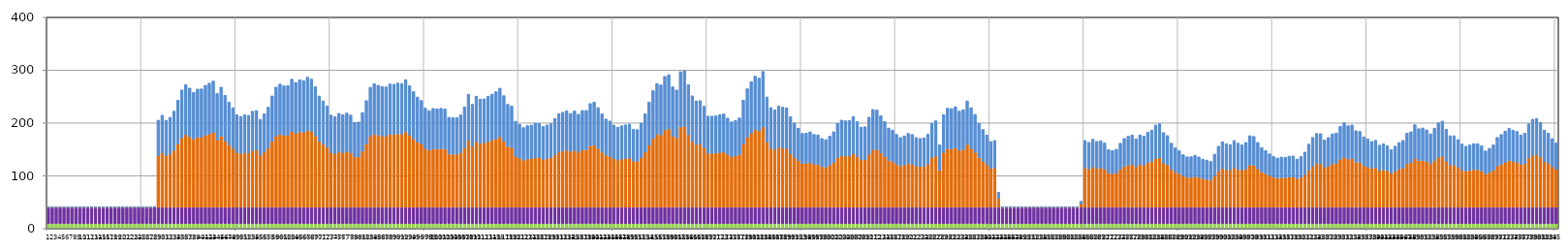
| Category | ВЛ_Корона | Т_ХХ | ВЛ_Нагр | Т_Нагр |
|---|---|---|---|---|
| 0 | 9.177 | 31 | 0 | 0 |
| 1 | 9.177 | 31 | 0 | 0 |
| 2 | 9.177 | 31 | 0 | 0 |
| 3 | 9.177 | 31 | 0 | 0 |
| 4 | 9.177 | 31 | 0 | 0 |
| 5 | 9.177 | 31 | 0 | 0 |
| 6 | 9.177 | 31 | 0 | 0 |
| 7 | 9.177 | 31 | 0 | 0 |
| 8 | 9.177 | 31 | 0 | 0 |
| 9 | 9.177 | 31 | 0 | 0 |
| 10 | 9.177 | 31 | 0 | 0 |
| 11 | 9.177 | 31 | 0 | 0 |
| 12 | 9.177 | 31 | 0 | 0 |
| 13 | 9.177 | 31 | 0 | 0 |
| 14 | 9.177 | 31 | 0 | 0 |
| 15 | 9.177 | 31 | 0 | 0 |
| 16 | 9.177 | 31 | 0 | 0 |
| 17 | 9.177 | 31 | 0 | 0 |
| 18 | 9.177 | 31 | 0 | 0 |
| 19 | 9.177 | 31 | 0 | 0 |
| 20 | 9.177 | 31 | 0 | 0 |
| 21 | 9.177 | 31 | 0 | 0 |
| 22 | 9.177 | 31 | 0 | 0 |
| 23 | 9.177 | 31 | 0 | 0 |
| 24 | 9.177 | 31 | 0 | 0 |
| 25 | 9.177 | 31 | 0 | 0 |
| 26 | 9.177 | 31 | 0 | 0 |
| 27 | 9.177 | 31 | 0.81 | 0.565 |
| 28 | 9.177 | 31 | 97.529 | 67.565 |
| 29 | 9.177 | 31 | 103.119 | 71.423 |
| 30 | 9.177 | 31 | 97.395 | 67.472 |
| 31 | 9.177 | 31 | 100.737 | 69.779 |
| 32 | 9.177 | 31 | 107.59 | 74.508 |
| 33 | 9.177 | 31 | 119.878 | 82.984 |
| 34 | 9.177 | 31 | 131.372 | 90.907 |
| 35 | 9.177 | 31 | 137.363 | 95.035 |
| 36 | 9.177 | 31 | 133.482 | 92.361 |
| 37 | 9.177 | 31 | 128.676 | 89.049 |
| 38 | 9.177 | 31 | 132.423 | 91.632 |
| 39 | 9.177 | 31 | 132.6 | 91.753 |
| 40 | 9.177 | 31 | 136.629 | 94.53 |
| 41 | 9.177 | 31 | 139.01 | 96.17 |
| 42 | 9.177 | 31 | 141.399 | 97.816 |
| 43 | 9.177 | 31 | 127.55 | 88.273 |
| 44 | 9.177 | 31 | 134.544 | 93.093 |
| 45 | 9.177 | 31 | 125.335 | 86.746 |
| 46 | 9.177 | 31 | 117.708 | 81.488 |
| 47 | 9.177 | 31 | 111.497 | 77.204 |
| 48 | 9.177 | 31 | 103.743 | 71.853 |
| 49 | 9.177 | 31 | 101.733 | 70.466 |
| 50 | 9.177 | 31 | 103.533 | 71.709 |
| 51 | 9.177 | 31 | 102.967 | 71.318 |
| 52 | 9.177 | 31 | 107.584 | 74.504 |
| 53 | 9.177 | 31 | 108.358 | 75.038 |
| 54 | 9.177 | 31 | 98.383 | 68.154 |
| 55 | 9.177 | 31 | 104.63 | 72.466 |
| 56 | 9.177 | 31 | 111.988 | 77.542 |
| 57 | 9.177 | 31 | 124.737 | 86.334 |
| 58 | 9.177 | 31 | 134.638 | 93.158 |
| 59 | 9.177 | 31 | 137.975 | 95.457 |
| 60 | 9.177 | 31 | 135.945 | 94.059 |
| 61 | 9.177 | 31 | 136.347 | 94.336 |
| 62 | 9.177 | 31 | 143.497 | 99.261 |
| 63 | 9.177 | 31 | 139.78 | 96.701 |
| 64 | 9.177 | 31 | 142.82 | 98.795 |
| 65 | 9.177 | 31 | 141.865 | 98.137 |
| 66 | 9.177 | 31 | 145.676 | 100.762 |
| 67 | 9.177 | 31 | 143.54 | 99.291 |
| 68 | 9.177 | 31 | 134.948 | 93.372 |
| 69 | 9.177 | 31 | 124.615 | 86.25 |
| 70 | 9.177 | 31 | 119.101 | 82.448 |
| 71 | 9.177 | 31 | 113.511 | 78.593 |
| 72 | 9.177 | 31 | 103.275 | 71.531 |
| 73 | 9.177 | 31 | 101.401 | 70.238 |
| 74 | 9.177 | 31 | 105.07 | 72.769 |
| 75 | 9.177 | 31 | 103.553 | 71.722 |
| 76 | 9.177 | 31 | 105.441 | 73.026 |
| 77 | 9.177 | 31 | 103.268 | 71.526 |
| 78 | 9.177 | 31 | 95.137 | 65.913 |
| 79 | 9.177 | 31 | 95.472 | 66.144 |
| 80 | 9.177 | 31 | 106.182 | 73.537 |
| 81 | 9.177 | 31 | 119.454 | 82.691 |
| 82 | 9.177 | 31 | 134.309 | 92.931 |
| 83 | 9.177 | 31 | 138.45 | 95.784 |
| 84 | 9.177 | 31 | 136.713 | 94.588 |
| 85 | 9.177 | 31 | 135.241 | 93.573 |
| 86 | 9.177 | 31 | 134.815 | 93.28 |
| 87 | 9.177 | 31 | 138.182 | 95.6 |
| 88 | 9.177 | 31 | 137.754 | 95.305 |
| 89 | 9.177 | 31 | 139.071 | 96.212 |
| 90 | 9.177 | 31 | 138.489 | 95.812 |
| 91 | 9.177 | 31 | 142.956 | 98.888 |
| 92 | 9.177 | 31 | 136.192 | 94.229 |
| 93 | 9.177 | 31 | 129.535 | 89.641 |
| 94 | 9.177 | 31 | 123.439 | 85.439 |
| 95 | 9.177 | 31 | 119.558 | 82.763 |
| 96 | 9.177 | 31 | 111.092 | 76.924 |
| 97 | 9.177 | 31 | 108.054 | 74.828 |
| 98 | 9.177 | 31 | 110.72 | 76.668 |
| 99 | 9.177 | 31 | 110.163 | 76.283 |
| 100 | 9.177 | 31 | 110.789 | 76.716 |
| 101 | 9.177 | 31 | 110.073 | 76.221 |
| 102 | 9.177 | 31 | 100.766 | 69.799 |
| 103 | 9.177 | 31 | 100.434 | 69.57 |
| 104 | 9.177 | 31 | 100.439 | 69.574 |
| 105 | 9.177 | 31 | 103.444 | 71.648 |
| 106 | 9.177 | 31 | 112.431 | 77.848 |
| 107 | 9.177 | 31 | 126.595 | 87.615 |
| 108 | 9.177 | 31 | 115.318 | 79.839 |
| 109 | 9.177 | 31 | 124.363 | 86.076 |
| 110 | 9.177 | 31 | 121.151 | 83.862 |
| 111 | 9.177 | 31 | 121.387 | 84.025 |
| 112 | 9.177 | 31 | 124.407 | 86.107 |
| 113 | 9.177 | 31 | 126.689 | 87.679 |
| 114 | 9.177 | 31 | 129.399 | 89.548 |
| 115 | 9.177 | 31 | 133.393 | 92.3 |
| 116 | 9.177 | 31 | 125.018 | 86.528 |
| 117 | 9.177 | 31 | 115.363 | 79.87 |
| 118 | 9.177 | 31 | 113.255 | 78.416 |
| 119 | 9.177 | 31 | 96.374 | 66.767 |
| 120 | 9.177 | 31 | 92.949 | 64.403 |
| 121 | 9.177 | 31 | 89.275 | 61.866 |
| 122 | 9.177 | 31 | 91.403 | 63.335 |
| 123 | 9.177 | 31 | 91.977 | 63.731 |
| 124 | 9.177 | 31 | 94.209 | 65.273 |
| 125 | 9.177 | 31 | 93.998 | 65.127 |
| 126 | 9.177 | 31 | 90.466 | 62.688 |
| 127 | 9.177 | 31 | 92.165 | 63.861 |
| 128 | 9.177 | 31 | 93.763 | 64.964 |
| 129 | 9.177 | 31 | 99.317 | 68.799 |
| 130 | 9.177 | 31 | 104.622 | 72.461 |
| 131 | 9.177 | 31 | 106.419 | 73.7 |
| 132 | 9.177 | 31 | 108.021 | 74.806 |
| 133 | 9.177 | 31 | 105.03 | 72.742 |
| 134 | 9.177 | 31 | 107.852 | 74.689 |
| 135 | 9.177 | 31 | 104.171 | 72.149 |
| 136 | 9.177 | 31 | 108.453 | 75.104 |
| 137 | 9.177 | 31 | 108.497 | 75.134 |
| 138 | 9.177 | 31 | 116.118 | 80.391 |
| 139 | 9.177 | 31 | 117.73 | 81.503 |
| 140 | 9.177 | 31 | 111.626 | 77.293 |
| 141 | 9.177 | 31 | 104.528 | 72.396 |
| 142 | 9.177 | 31 | 98.86 | 68.484 |
| 143 | 9.177 | 31 | 96.624 | 66.94 |
| 144 | 9.177 | 31 | 92.08 | 63.802 |
| 145 | 9.177 | 31 | 89.652 | 62.126 |
| 146 | 9.177 | 31 | 91.301 | 63.265 |
| 147 | 9.177 | 31 | 92.341 | 63.983 |
| 148 | 9.177 | 31 | 93.19 | 64.569 |
| 149 | 9.177 | 31 | 87.327 | 60.52 |
| 150 | 9.177 | 31 | 87.032 | 60.316 |
| 151 | 9.177 | 31 | 94.347 | 65.368 |
| 152 | 9.177 | 31 | 104.693 | 72.509 |
| 153 | 9.177 | 31 | 117.86 | 81.592 |
| 154 | 9.177 | 31 | 130.629 | 90.395 |
| 155 | 9.177 | 31 | 138.604 | 95.891 |
| 156 | 9.177 | 31 | 136.994 | 94.781 |
| 157 | 9.177 | 31 | 146.572 | 101.379 |
| 158 | 9.177 | 31 | 148.518 | 102.719 |
| 159 | 9.177 | 31 | 134.882 | 93.326 |
| 160 | 9.177 | 31 | 131.37 | 90.906 |
| 161 | 9.177 | 31 | 151.876 | 105.032 |
| 162 | 9.177 | 31 | 152.964 | 105.781 |
| 163 | 9.177 | 31 | 137.388 | 95.053 |
| 164 | 9.177 | 31 | 124.842 | 86.406 |
| 165 | 9.177 | 31 | 119.102 | 82.449 |
| 166 | 9.177 | 31 | 119.375 | 82.637 |
| 167 | 9.177 | 31 | 113.138 | 78.336 |
| 168 | 9.177 | 31 | 102.065 | 70.696 |
| 169 | 9.177 | 31 | 102.107 | 70.725 |
| 170 | 9.177 | 31 | 102.37 | 70.906 |
| 171 | 9.177 | 31 | 103.681 | 71.811 |
| 172 | 9.177 | 31 | 104.459 | 72.348 |
| 173 | 9.177 | 31 | 99.83 | 69.153 |
| 174 | 9.177 | 31 | 95.695 | 66.298 |
| 175 | 9.177 | 31 | 97.155 | 67.306 |
| 176 | 9.177 | 31 | 100.005 | 69.274 |
| 177 | 9.177 | 31 | 119.925 | 83.016 |
| 178 | 9.177 | 31 | 132.723 | 91.839 |
| 179 | 9.177 | 31 | 140.69 | 97.327 |
| 180 | 9.177 | 31 | 146.823 | 101.552 |
| 181 | 9.177 | 31 | 144.625 | 100.038 |
| 182 | 9.177 | 31 | 152.119 | 105.199 |
| 183 | 9.177 | 31 | 123.484 | 85.47 |
| 184 | 9.177 | 31 | 111.703 | 77.346 |
| 185 | 9.177 | 31 | 109.154 | 75.587 |
| 186 | 9.177 | 31 | 113.327 | 78.466 |
| 187 | 9.177 | 31 | 112.153 | 77.656 |
| 188 | 9.177 | 31 | 111.331 | 77.089 |
| 189 | 9.177 | 31 | 101.41 | 70.244 |
| 190 | 9.177 | 31 | 94.302 | 65.337 |
| 191 | 9.177 | 31 | 88.574 | 61.381 |
| 192 | 9.177 | 31 | 82.717 | 57.335 |
| 193 | 9.177 | 31 | 82.994 | 57.527 |
| 194 | 9.177 | 31 | 84.479 | 58.553 |
| 195 | 9.177 | 31 | 81.556 | 56.533 |
| 196 | 9.177 | 31 | 81.037 | 56.175 |
| 197 | 9.177 | 31 | 77.026 | 53.403 |
| 198 | 9.177 | 31 | 75.782 | 52.543 |
| 199 | 9.177 | 31 | 79.732 | 55.272 |
| 200 | 9.177 | 31 | 84.642 | 58.665 |
| 201 | 9.177 | 31 | 93.975 | 65.111 |
| 202 | 9.177 | 31 | 97.654 | 67.651 |
| 203 | 9.177 | 31 | 96.917 | 67.142 |
| 204 | 9.177 | 31 | 97.137 | 67.294 |
| 205 | 9.177 | 31 | 101.632 | 70.397 |
| 206 | 9.177 | 31 | 95.987 | 66.5 |
| 207 | 9.177 | 31 | 89.831 | 62.249 |
| 208 | 9.177 | 31 | 90.141 | 62.463 |
| 209 | 9.177 | 31 | 100.873 | 69.873 |
| 210 | 9.177 | 31 | 109.557 | 75.865 |
| 211 | 9.177 | 31 | 108.941 | 75.441 |
| 212 | 9.177 | 31 | 102.603 | 71.067 |
| 213 | 9.177 | 31 | 95.988 | 66.501 |
| 214 | 9.177 | 31 | 88.648 | 61.432 |
| 215 | 9.177 | 31 | 86.37 | 59.859 |
| 216 | 9.177 | 31 | 81.584 | 56.553 |
| 217 | 9.177 | 31 | 78.183 | 54.202 |
| 218 | 9.177 | 31 | 79.797 | 55.318 |
| 219 | 9.177 | 31 | 82.72 | 57.337 |
| 220 | 9.177 | 31 | 81.506 | 56.498 |
| 221 | 9.177 | 31 | 78.142 | 54.174 |
| 222 | 9.177 | 31 | 77.077 | 53.438 |
| 223 | 9.177 | 31 | 77.732 | 53.891 |
| 224 | 9.177 | 31 | 81.791 | 56.696 |
| 225 | 9.177 | 31 | 94.15 | 65.232 |
| 226 | 9.177 | 31 | 96.9 | 67.13 |
| 227 | 9.177 | 31 | 69.86 | 48.449 |
| 228 | 9.177 | 31 | 103.688 | 71.816 |
| 229 | 9.177 | 31 | 110.973 | 76.842 |
| 230 | 9.177 | 31 | 110.549 | 76.55 |
| 231 | 9.177 | 31 | 112.434 | 77.85 |
| 232 | 9.177 | 31 | 107.645 | 74.546 |
| 233 | 9.177 | 31 | 109.274 | 75.67 |
| 234 | 9.177 | 31 | 119.008 | 82.384 |
| 235 | 9.177 | 31 | 111.51 | 77.213 |
| 236 | 9.177 | 31 | 104.048 | 72.064 |
| 237 | 9.177 | 31 | 94.026 | 65.146 |
| 238 | 9.177 | 31 | 87.043 | 60.324 |
| 239 | 9.177 | 31 | 80.808 | 56.016 |
| 240 | 9.177 | 31 | 73.661 | 51.077 |
| 241 | 9.177 | 31 | 74.829 | 51.884 |
| 242 | 9.177 | 31 | 16.784 | 11.675 |
| 243 | 9.177 | 31 | 0 | 0 |
| 244 | 9.177 | 31 | 0 | 0 |
| 245 | 9.177 | 31 | 0 | 0 |
| 246 | 9.177 | 31 | 0 | 0 |
| 247 | 9.177 | 31 | 0 | 0 |
| 248 | 9.177 | 31 | 0 | 0 |
| 249 | 9.177 | 31 | 0 | 0 |
| 250 | 9.177 | 31 | 0 | 0 |
| 251 | 9.177 | 31 | 0 | 0 |
| 252 | 9.177 | 31 | 0 | 0 |
| 253 | 9.177 | 31 | 0 | 0 |
| 254 | 9.177 | 31 | 0 | 0 |
| 255 | 9.177 | 31 | 0 | 0 |
| 256 | 9.177 | 31 | 0 | 0 |
| 257 | 9.177 | 31 | 0 | 0 |
| 258 | 9.177 | 31 | 0 | 0 |
| 259 | 9.177 | 31 | 0 | 0 |
| 260 | 9.177 | 31 | 0 | 0 |
| 261 | 9.177 | 31 | 0 | 0 |
| 262 | 9.177 | 31 | 0 | 0 |
| 263 | 9.177 | 31 | 6.784 | 4.724 |
| 264 | 9.177 | 31 | 74.785 | 51.854 |
| 265 | 9.177 | 31 | 72.699 | 50.412 |
| 266 | 9.177 | 31 | 76.163 | 52.806 |
| 267 | 9.177 | 31 | 73.795 | 51.169 |
| 268 | 9.177 | 31 | 74.526 | 51.674 |
| 269 | 9.177 | 31 | 72.003 | 49.931 |
| 270 | 9.177 | 31 | 64.467 | 44.719 |
| 271 | 9.177 | 31 | 63.638 | 44.146 |
| 272 | 9.177 | 31 | 65.054 | 45.125 |
| 273 | 9.177 | 31 | 71.719 | 49.734 |
| 274 | 9.177 | 31 | 77.069 | 53.432 |
| 275 | 9.177 | 31 | 79.556 | 55.151 |
| 276 | 9.177 | 31 | 80.894 | 56.075 |
| 277 | 9.177 | 31 | 76.666 | 53.154 |
| 278 | 9.177 | 31 | 80.954 | 56.117 |
| 279 | 9.177 | 31 | 79.592 | 55.176 |
| 280 | 9.177 | 31 | 84.136 | 58.316 |
| 281 | 9.177 | 31 | 86.326 | 59.829 |
| 282 | 9.177 | 31 | 92.101 | 63.817 |
| 283 | 9.177 | 31 | 93.66 | 64.894 |
| 284 | 9.177 | 31 | 83.644 | 57.975 |
| 285 | 9.177 | 31 | 80.337 | 55.691 |
| 286 | 9.177 | 31 | 71.772 | 49.771 |
| 287 | 9.177 | 31 | 66.593 | 46.189 |
| 288 | 9.177 | 31 | 63.423 | 43.997 |
| 289 | 9.177 | 31 | 58.977 | 40.921 |
| 290 | 9.177 | 31 | 56.584 | 39.265 |
| 291 | 9.177 | 31 | 56.664 | 39.32 |
| 292 | 9.177 | 31 | 58.156 | 40.353 |
| 293 | 9.177 | 31 | 56.411 | 39.146 |
| 294 | 9.177 | 31 | 53.96 | 37.449 |
| 295 | 9.177 | 31 | 52.868 | 36.693 |
| 296 | 9.177 | 31 | 51.313 | 35.617 |
| 297 | 9.177 | 31 | 59.506 | 41.287 |
| 298 | 9.177 | 31 | 68.386 | 47.43 |
| 299 | 9.177 | 31 | 73.408 | 50.902 |
| 300 | 9.177 | 31 | 71.261 | 49.417 |
| 301 | 9.177 | 31 | 70.194 | 48.68 |
| 302 | 9.177 | 31 | 74.832 | 51.886 |
| 303 | 9.177 | 31 | 71.789 | 49.783 |
| 304 | 9.177 | 31 | 69.901 | 48.477 |
| 305 | 9.177 | 31 | 72.607 | 50.348 |
| 306 | 9.177 | 31 | 80.171 | 55.576 |
| 307 | 9.177 | 31 | 79.314 | 54.984 |
| 308 | 9.177 | 31 | 72.632 | 50.366 |
| 309 | 9.177 | 31 | 66.864 | 46.377 |
| 310 | 9.177 | 31 | 63.597 | 44.118 |
| 311 | 9.177 | 31 | 59.879 | 41.545 |
| 312 | 9.177 | 31 | 56.854 | 39.452 |
| 313 | 9.177 | 31 | 55.174 | 38.289 |
| 314 | 9.177 | 31 | 56.264 | 39.044 |
| 315 | 9.177 | 31 | 56.032 | 38.883 |
| 316 | 9.177 | 31 | 57.239 | 39.718 |
| 317 | 9.177 | 31 | 57.557 | 39.938 |
| 318 | 9.177 | 31 | 54.044 | 37.507 |
| 319 | 9.177 | 31 | 56.8 | 39.414 |
| 320 | 9.177 | 31 | 61.814 | 42.884 |
| 321 | 9.177 | 31 | 70.749 | 49.063 |
| 322 | 9.177 | 31 | 78.232 | 54.236 |
| 323 | 9.177 | 31 | 82.631 | 57.276 |
| 324 | 9.177 | 31 | 82.401 | 57.117 |
| 325 | 9.177 | 31 | 75.42 | 52.293 |
| 326 | 9.177 | 31 | 78.107 | 54.15 |
| 327 | 9.177 | 31 | 82.164 | 56.953 |
| 328 | 9.177 | 31 | 83.249 | 57.703 |
| 329 | 9.177 | 31 | 90.647 | 62.813 |
| 330 | 9.177 | 31 | 94.625 | 65.56 |
| 331 | 9.177 | 31 | 91.311 | 63.272 |
| 332 | 9.177 | 31 | 92.165 | 63.861 |
| 333 | 9.177 | 31 | 85.755 | 59.434 |
| 334 | 9.177 | 31 | 84.864 | 58.819 |
| 335 | 9.177 | 31 | 78.773 | 54.61 |
| 336 | 9.177 | 31 | 76.411 | 52.978 |
| 337 | 9.177 | 31 | 73.687 | 51.095 |
| 338 | 9.177 | 31 | 75.019 | 52.015 |
| 339 | 9.177 | 31 | 69.589 | 48.262 |
| 340 | 9.177 | 31 | 71.094 | 49.302 |
| 341 | 9.177 | 31 | 68.98 | 47.841 |
| 342 | 9.177 | 31 | 64.628 | 44.831 |
| 343 | 9.177 | 31 | 68.503 | 47.511 |
| 344 | 9.177 | 31 | 72.479 | 50.26 |
| 345 | 9.177 | 31 | 74.897 | 51.931 |
| 346 | 9.177 | 31 | 82.934 | 57.485 |
| 347 | 9.177 | 31 | 84.507 | 58.572 |
| 348 | 9.177 | 31 | 92.425 | 64.041 |
| 349 | 9.177 | 31 | 87.983 | 60.973 |
| 350 | 9.177 | 31 | 88.756 | 61.507 |
| 351 | 9.177 | 31 | 86.708 | 60.092 |
| 352 | 9.177 | 31 | 82.185 | 56.968 |
| 353 | 9.177 | 31 | 88.548 | 61.363 |
| 354 | 9.177 | 31 | 94.662 | 65.585 |
| 355 | 9.177 | 31 | 96.501 | 66.855 |
| 356 | 9.177 | 31 | 87.323 | 60.517 |
| 357 | 9.177 | 31 | 80.116 | 55.538 |
| 358 | 9.177 | 31 | 80.022 | 55.473 |
| 359 | 9.177 | 31 | 75.96 | 52.666 |
| 360 | 9.177 | 31 | 70.816 | 49.11 |
| 361 | 9.177 | 31 | 68.325 | 47.387 |
| 362 | 9.177 | 31 | 69.817 | 48.419 |
| 363 | 9.177 | 31 | 71.287 | 49.435 |
| 364 | 9.177 | 31 | 71.071 | 49.286 |
| 365 | 9.177 | 31 | 68.761 | 47.689 |
| 366 | 9.177 | 31 | 63.067 | 43.751 |
| 367 | 9.177 | 31 | 66.035 | 45.804 |
| 368 | 9.177 | 31 | 69.918 | 48.489 |
| 369 | 9.177 | 31 | 78.22 | 54.228 |
| 370 | 9.177 | 31 | 81.47 | 56.474 |
| 371 | 9.177 | 31 | 85.233 | 59.074 |
| 372 | 9.177 | 31 | 88.564 | 61.374 |
| 373 | 9.177 | 31 | 86.36 | 59.852 |
| 374 | 9.177 | 31 | 84.828 | 58.793 |
| 375 | 9.177 | 31 | 80.936 | 56.104 |
| 376 | 9.177 | 31 | 83.066 | 57.576 |
| 377 | 9.177 | 31 | 93.53 | 64.804 |
| 378 | 9.177 | 31 | 98.576 | 68.288 |
| 379 | 9.177 | 31 | 99.451 | 68.892 |
| 380 | 9.177 | 31 | 95.147 | 65.92 |
| 381 | 9.177 | 31 | 86.329 | 59.831 |
| 382 | 9.177 | 31 | 83.117 | 57.611 |
| 383 | 9.177 | 31 | 76.9 | 53.316 |
| 384 | 9.177 | 31 | 71.924 | 49.876 |